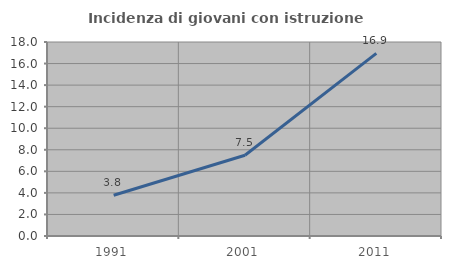
| Category | Incidenza di giovani con istruzione universitaria |
|---|---|
| 1991.0 | 3.78 |
| 2001.0 | 7.492 |
| 2011.0 | 16.944 |